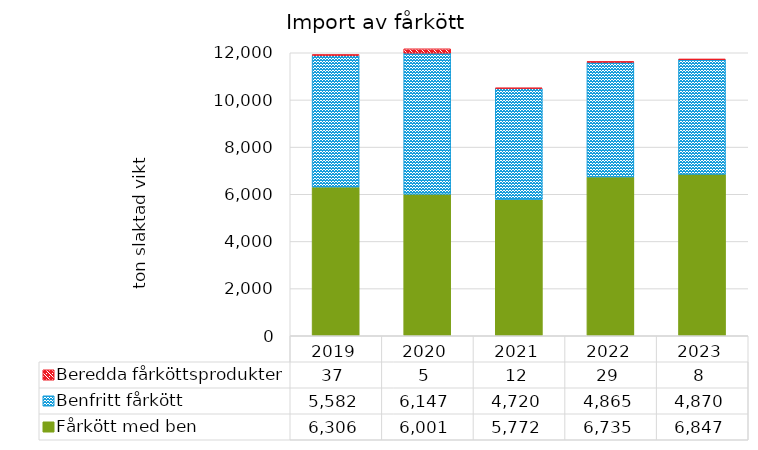
| Category | Fårkött med ben | Benfritt fårkött | Beredda fårköttsprodukter |
|---|---|---|---|
| 2019 | 6306 | 5581.667 | 37.333 |
| 2020 | 6001 | 6146.667 | 5.333 |
| 2021 | 5772 | 4720 | 12 |
| 2022 | 6735 | 4865 | 29.333 |
| 2023 | 6847 | 4870 | 8 |